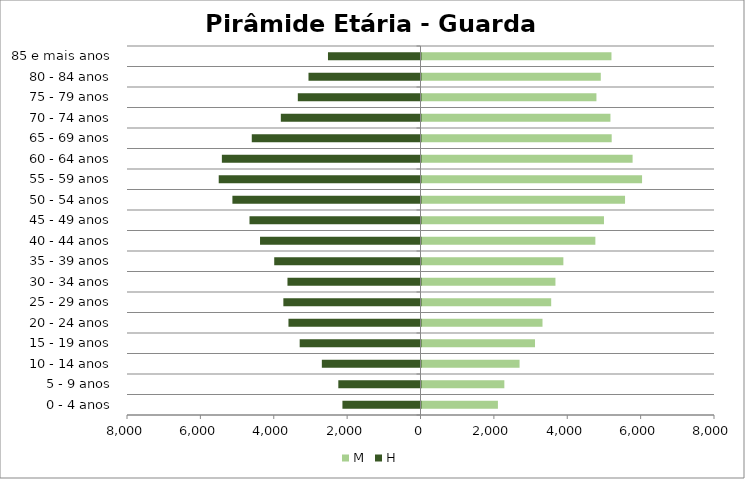
| Category | M | H |
|---|---|---|
| 0 - 4 anos | 2083 | -2128 |
| 5 - 9 anos | 2258 | -2240 |
| 10 - 14 anos | 2673 | -2689 |
| 15 - 19 anos | 3094 | -3293 |
| 20 - 24 anos | 3298 | -3599 |
| 25 - 29 anos | 3535 | -3738 |
| 30 - 34 anos | 3651 | -3626 |
| 35 - 39 anos | 3867 | -3987 |
| 40 - 44 anos | 4739 | -4374 |
| 45 - 49 anos | 4974 | -4661 |
| 50 - 54 anos | 5548 | -5127 |
| 55 - 59 anos | 6012 | -5500 |
| 60 - 64 anos | 5754 | -5414 |
| 65 - 69 anos | 5184 | -4599 |
| 70 - 74 anos | 5150 | -3807 |
| 75 - 79 anos | 4768 | -3344 |
| 80 - 84 anos | 4887 | -3053 |
| 85 e mais anos | 5178 | -2522 |